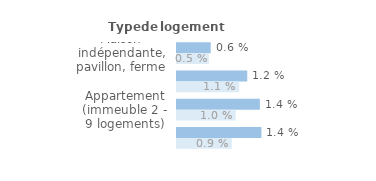
| Category | Series 1 | Series 0 |
|---|---|---|
| Maison indépendante, pavillon, ferme | 0.006 | 0.005 |
| Maison de ville groupée | 0.012 | 0.011 |
| Appartement (immeuble 2 - 9 logements) | 0.014 | 0.01 |
| Appartement (immeuble de 10 logements ou +) | 0.014 | 0.009 |